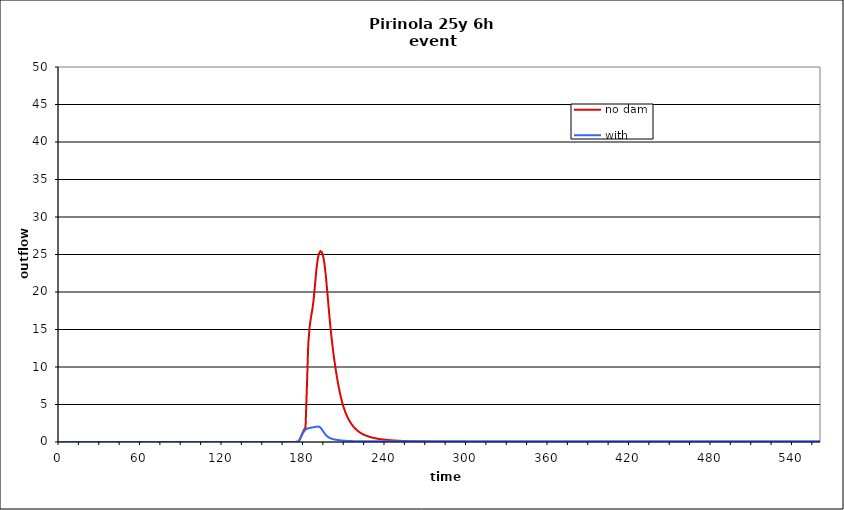
| Category | no dam | with dam |
|---|---|---|
| 0.0 | 0 | 0 |
| 1.0 | 0 | 0 |
| 2.0 | 0 | 0 |
| 3.0 | 0 | 0 |
| 4.0 | 0 | 0 |
| 5.0 | 0 | 0 |
| 6.0 | 0 | 0 |
| 7.0 | 0 | 0 |
| 8.0 | 0 | 0 |
| 9.0 | 0 | 0 |
| 10.0 | 0 | 0 |
| 11.0 | 0 | 0 |
| 12.0 | 0 | 0 |
| 13.0 | 0 | 0 |
| 14.0 | 0 | 0 |
| 15.0 | 0 | 0 |
| 16.0 | 0 | 0 |
| 17.0 | 0 | 0 |
| 18.0 | 0 | 0 |
| 19.0 | 0 | 0 |
| 20.0 | 0 | 0 |
| 21.0 | 0 | 0 |
| 22.0 | 0 | 0 |
| 23.0 | 0 | 0 |
| 24.0 | 0 | 0 |
| 25.0 | 0 | 0 |
| 26.0 | 0 | 0 |
| 27.0 | 0 | 0 |
| 28.0 | 0 | 0 |
| 29.0 | 0 | 0 |
| 30.0 | 0 | 0 |
| 31.0 | 0 | 0 |
| 32.0 | 0 | 0 |
| 33.0 | 0 | 0 |
| 34.0 | 0 | 0 |
| 35.0 | 0 | 0 |
| 36.0 | 0 | 0 |
| 37.0 | 0 | 0 |
| 38.0 | 0 | 0 |
| 39.0 | 0 | 0 |
| 40.0 | 0 | 0 |
| 41.0 | 0 | 0 |
| 42.0 | 0 | 0 |
| 43.0 | 0 | 0 |
| 44.0 | 0 | 0 |
| 45.0 | 0 | 0 |
| 46.0 | 0 | 0 |
| 47.0 | 0 | 0 |
| 48.0 | 0 | 0 |
| 49.0 | 0 | 0 |
| 50.0 | 0 | 0 |
| 51.0 | 0 | 0 |
| 52.0 | 0 | 0 |
| 53.0 | 0 | 0 |
| 54.0 | 0 | 0 |
| 55.0 | 0 | 0 |
| 56.0 | 0 | 0 |
| 57.0 | 0 | 0 |
| 58.0 | 0 | 0 |
| 59.0 | 0 | 0 |
| 60.0 | 0 | 0 |
| 61.0 | 0 | 0 |
| 62.0 | 0 | 0 |
| 63.0 | 0 | 0 |
| 64.0 | 0 | 0 |
| 65.0 | 0 | 0 |
| 66.0 | 0 | 0 |
| 67.0 | 0 | 0 |
| 68.0 | 0 | 0 |
| 69.0 | 0 | 0 |
| 70.0 | 0 | 0 |
| 71.0 | 0 | 0 |
| 72.0 | 0 | 0 |
| 73.0 | 0 | 0 |
| 74.0 | 0 | 0 |
| 75.0 | 0 | 0 |
| 76.0 | 0 | 0 |
| 77.0 | 0 | 0 |
| 78.0 | 0 | 0 |
| 79.0 | 0 | 0 |
| 80.0 | 0 | 0 |
| 81.0 | 0 | 0 |
| 82.0 | 0 | 0 |
| 83.0 | 0 | 0 |
| 84.0 | 0 | 0 |
| 85.0 | 0 | 0 |
| 86.0 | 0 | 0 |
| 87.0 | 0 | 0 |
| 88.0 | 0 | 0 |
| 89.0 | 0 | 0 |
| 90.0 | 0 | 0 |
| 91.0 | 0 | 0 |
| 92.0 | 0 | 0 |
| 93.0 | 0 | 0 |
| 94.0 | 0 | 0 |
| 95.0 | 0 | 0 |
| 96.0 | 0 | 0 |
| 97.0 | 0 | 0 |
| 98.0 | 0 | 0 |
| 99.0 | 0 | 0 |
| 100.0 | 0 | 0 |
| 101.0 | 0 | 0 |
| 102.0 | 0 | 0 |
| 103.0 | 0 | 0 |
| 104.0 | 0 | 0 |
| 105.0 | 0 | 0 |
| 106.0 | 0 | 0 |
| 107.0 | 0 | 0 |
| 108.0 | 0 | 0 |
| 109.0 | 0 | 0 |
| 110.0 | 0 | 0 |
| 111.0 | 0 | 0 |
| 112.0 | 0 | 0 |
| 113.0 | 0 | 0 |
| 114.0 | 0 | 0 |
| 115.0 | 0 | 0 |
| 116.0 | 0 | 0 |
| 117.0 | 0 | 0 |
| 118.0 | 0 | 0 |
| 119.0 | 0 | 0 |
| 120.0 | 0 | 0 |
| 121.0 | 0 | 0 |
| 122.0 | 0 | 0 |
| 123.0 | 0 | 0 |
| 124.0 | 0 | 0 |
| 125.0 | 0 | 0 |
| 126.0 | 0 | 0 |
| 127.0 | 0 | 0 |
| 128.0 | 0 | 0 |
| 129.0 | 0 | 0 |
| 130.0 | 0 | 0 |
| 131.0 | 0 | 0 |
| 132.0 | 0 | 0 |
| 133.0 | 0 | 0 |
| 134.0 | 0 | 0 |
| 135.0 | 0 | 0 |
| 136.0 | 0 | 0 |
| 137.0 | 0 | 0 |
| 138.0 | 0 | 0 |
| 139.0 | 0 | 0 |
| 140.0 | 0 | 0 |
| 141.0 | 0 | 0 |
| 142.0 | 0 | 0 |
| 143.0 | 0 | 0 |
| 144.0 | 0 | 0 |
| 145.0 | 0 | 0 |
| 146.0 | 0 | 0 |
| 147.0 | 0 | 0 |
| 148.0 | 0 | 0 |
| 149.0 | 0 | 0 |
| 150.0 | 0 | 0 |
| 151.0 | 0 | 0 |
| 152.0 | 0 | 0 |
| 153.0 | 0 | 0 |
| 154.0 | 0 | 0 |
| 155.0 | 0 | 0 |
| 156.0 | 0 | 0 |
| 157.0 | 0 | 0 |
| 158.0 | 0 | 0 |
| 159.0 | 0 | 0 |
| 160.0 | 0 | 0 |
| 161.0 | 0 | 0 |
| 162.0 | 0 | 0 |
| 163.0 | 0 | 0 |
| 164.0 | 0 | 0 |
| 165.0 | 0 | 0 |
| 166.0 | 0 | 0 |
| 167.0 | 0 | 0 |
| 168.0 | 0 | 0 |
| 169.0 | 0 | 0 |
| 170.0 | 0 | 0 |
| 171.0 | 0 | 0 |
| 172.0 | 0.001 | 0.001 |
| 173.0 | 0.005 | 0.005 |
| 174.0 | 0.016 | 0.016 |
| 175.0 | 0.035 | 0.036 |
| 176.0 | 0.067 | 0.06 |
| 177.0 | 0.464 | 0.407 |
| 178.0 | 0.874 | 0.773 |
| 179.0 | 1.299 | 1.151 |
| 180.0 | 1.665 | 1.454 |
| 181.0 | 1.937 | 1.647 |
| 182.0 | 7.318 | 1.752 |
| 183.0 | 13.035 | 1.816 |
| 184.0 | 15.331 | 1.864 |
| 185.0 | 16.633 | 1.903 |
| 186.0 | 17.663 | 1.939 |
| 187.0 | 19.027 | 1.972 |
| 188.0 | 21.022 | 2.002 |
| 189.0 | 23.011 | 2.03 |
| 190.0 | 24.413 | 2.056 |
| 191.0 | 25.185 | 2.043 |
| 192.0 | 25.445 | 1.918 |
| 193.0 | 25.321 | 1.7 |
| 194.0 | 24.767 | 1.424 |
| 195.0 | 23.692 | 1.149 |
| 196.0 | 22.064 | 0.922 |
| 197.0 | 20.084 | 0.751 |
| 198.0 | 17.967 | 0.622 |
| 199.0 | 15.946 | 0.526 |
| 200.0 | 14.151 | 0.453 |
| 201.0 | 12.583 | 0.397 |
| 202.0 | 11.195 | 0.353 |
| 203.0 | 9.932 | 0.317 |
| 204.0 | 8.777 | 0.286 |
| 205.0 | 7.731 | 0.258 |
| 206.0 | 6.801 | 0.234 |
| 207.0 | 5.984 | 0.213 |
| 208.0 | 5.273 | 0.194 |
| 209.0 | 4.659 | 0.178 |
| 210.0 | 4.129 | 0.164 |
| 211.0 | 3.67 | 0.152 |
| 212.0 | 3.273 | 0.142 |
| 213.0 | 2.925 | 0.134 |
| 214.0 | 2.619 | 0.127 |
| 215.0 | 2.349 | 0.121 |
| 216.0 | 2.109 | 0.116 |
| 217.0 | 1.898 | 0.111 |
| 218.0 | 1.712 | 0.107 |
| 219.0 | 1.549 | 0.103 |
| 220.0 | 1.404 | 0.1 |
| 221.0 | 1.276 | 0.098 |
| 222.0 | 1.164 | 0.096 |
| 223.0 | 1.064 | 0.094 |
| 224.0 | 0.975 | 0.093 |
| 225.0 | 0.896 | 0.091 |
| 226.0 | 0.824 | 0.09 |
| 227.0 | 0.759 | 0.089 |
| 228.0 | 0.7 | 0.089 |
| 229.0 | 0.646 | 0.088 |
| 230.0 | 0.596 | 0.088 |
| 231.0 | 0.551 | 0.088 |
| 232.0 | 0.511 | 0.088 |
| 233.0 | 0.474 | 0.088 |
| 234.0 | 0.441 | 0.087 |
| 235.0 | 0.411 | 0.087 |
| 236.0 | 0.383 | 0.087 |
| 237.0 | 0.358 | 0.087 |
| 238.0 | 0.335 | 0.087 |
| 239.0 | 0.314 | 0.087 |
| 240.0 | 0.294 | 0.087 |
| 241.0 | 0.276 | 0.087 |
| 242.0 | 0.259 | 0.087 |
| 243.0 | 0.244 | 0.087 |
| 244.0 | 0.23 | 0.087 |
| 245.0 | 0.216 | 0.087 |
| 246.0 | 0.204 | 0.087 |
| 247.0 | 0.192 | 0.087 |
| 248.0 | 0.182 | 0.087 |
| 249.0 | 0.172 | 0.087 |
| 250.0 | 0.162 | 0.087 |
| 251.0 | 0.153 | 0.087 |
| 252.0 | 0.145 | 0.087 |
| 253.0 | 0.138 | 0.087 |
| 254.0 | 0.13 | 0.087 |
| 255.0 | 0.124 | 0.087 |
| 256.0 | 0.117 | 0.087 |
| 257.0 | 0.111 | 0.087 |
| 258.0 | 0.106 | 0.087 |
| 259.0 | 0.1 | 0.087 |
| 260.0 | 0.095 | 0.087 |
| 261.0 | 0.09 | 0.087 |
| 262.0 | 0.086 | 0.087 |
| 263.0 | 0.082 | 0.087 |
| 264.0 | 0.078 | 0.087 |
| 265.0 | 0.074 | 0.087 |
| 266.0 | 0.07 | 0.087 |
| 267.0 | 0.067 | 0.087 |
| 268.0 | 0.064 | 0.087 |
| 269.0 | 0.061 | 0.087 |
| 270.0 | 0.058 | 0.087 |
| 271.0 | 0.055 | 0.087 |
| 272.0 | 0.053 | 0.087 |
| 273.0 | 0.05 | 0.087 |
| 274.0 | 0.048 | 0.087 |
| 275.0 | 0.046 | 0.087 |
| 276.0 | 0.044 | 0.087 |
| 277.0 | 0.042 | 0.087 |
| 278.0 | 0.04 | 0.087 |
| 279.0 | 0.038 | 0.087 |
| 280.0 | 0.036 | 0.087 |
| 281.0 | 0.035 | 0.087 |
| 282.0 | 0.033 | 0.087 |
| 283.0 | 0.032 | 0.087 |
| 284.0 | 0.03 | 0.087 |
| 285.0 | 0.029 | 0.087 |
| 286.0 | 0.028 | 0.087 |
| 287.0 | 0.027 | 0.087 |
| 288.0 | 0.026 | 0.087 |
| 289.0 | 0.025 | 0.087 |
| 290.0 | 0.023 | 0.087 |
| 291.0 | 0.022 | 0.087 |
| 292.0 | 0.022 | 0.087 |
| 293.0 | 0.021 | 0.087 |
| 294.0 | 0.02 | 0.087 |
| 295.0 | 0.019 | 0.087 |
| 296.0 | 0.018 | 0.087 |
| 297.0 | 0.017 | 0.087 |
| 298.0 | 0.017 | 0.087 |
| 299.0 | 0.016 | 0.087 |
| 300.0 | 0.015 | 0.087 |
| 301.0 | 0.015 | 0.087 |
| 302.0 | 0.014 | 0.087 |
| 303.0 | 0.014 | 0.087 |
| 304.0 | 0.013 | 0.087 |
| 305.0 | 0.013 | 0.087 |
| 306.0 | 0.012 | 0.087 |
| 307.0 | 0.012 | 0.087 |
| 308.0 | 0.011 | 0.087 |
| 309.0 | 0.011 | 0.087 |
| 310.0 | 0.01 | 0.087 |
| 311.0 | 0.01 | 0.087 |
| 312.0 | 0.009 | 0.087 |
| 313.0 | 0.009 | 0.087 |
| 314.0 | 0.009 | 0.087 |
| 315.0 | 0.008 | 0.087 |
| 316.0 | 0.008 | 0.087 |
| 317.0 | 0.007 | 0.087 |
| 318.0 | 0.007 | 0.087 |
| 319.0 | 0.007 | 0.087 |
| 320.0 | 0.006 | 0.087 |
| 321.0 | 0.006 | 0.087 |
| 322.0 | 0.006 | 0.087 |
| 323.0 | 0.006 | 0.087 |
| 324.0 | 0.005 | 0.087 |
| 325.0 | 0.005 | 0.087 |
| 326.0 | 0.005 | 0.087 |
| 327.0 | 0.005 | 0.087 |
| 328.0 | 0.004 | 0.087 |
| 329.0 | 0.004 | 0.087 |
| 330.0 | 0.004 | 0.087 |
| 331.0 | 0.004 | 0.087 |
| 332.0 | 0.004 | 0.087 |
| 333.0 | 0.003 | 0.087 |
| 334.0 | 0.003 | 0.087 |
| 335.0 | 0.003 | 0.087 |
| 336.0 | 0.003 | 0.087 |
| 337.0 | 0.003 | 0.087 |
| 338.0 | 0.003 | 0.087 |
| 339.0 | 0.002 | 0.087 |
| 340.0 | 0.002 | 0.087 |
| 341.0 | 0.002 | 0.087 |
| 342.0 | 0.002 | 0.087 |
| 343.0 | 0.002 | 0.087 |
| 344.0 | 0.002 | 0.087 |
| 345.0 | 0.002 | 0.087 |
| 346.0 | 0.002 | 0.087 |
| 347.0 | 0.001 | 0.087 |
| 348.0 | 0.001 | 0.087 |
| 349.0 | 0.001 | 0.087 |
| 350.0 | 0.001 | 0.087 |
| 351.0 | 0.001 | 0.087 |
| 352.0 | 0.001 | 0.087 |
| 353.0 | 0.001 | 0.087 |
| 354.0 | 0.001 | 0.087 |
| 355.0 | 0.001 | 0.087 |
| 356.0 | 0.001 | 0.087 |
| 357.0 | 0.001 | 0.087 |
| 358.0 | 0.001 | 0.087 |
| 359.0 | 0.001 | 0.087 |
| 360.0 | 0.001 | 0.087 |
| 361.0 | 0.001 | 0.087 |
| 362.0 | 0 | 0.087 |
| 363.0 | 0 | 0.087 |
| 364.0 | 0 | 0.087 |
| 365.0 | 0 | 0.087 |
| 366.0 | 0 | 0.087 |
| 367.0 | 0 | 0.087 |
| 368.0 | 0 | 0.087 |
| 369.0 | 0 | 0.087 |
| 370.0 | 0 | 0.087 |
| 371.0 | 0 | 0.087 |
| 372.0 | 0 | 0.087 |
| 373.0 | 0 | 0.087 |
| 374.0 | 0 | 0.087 |
| 375.0 | 0 | 0.087 |
| 376.0 | 0 | 0.087 |
| 377.0 | 0 | 0.087 |
| 378.0 | 0 | 0.087 |
| 379.0 | 0 | 0.087 |
| 380.0 | 0 | 0.087 |
| 381.0 | 0 | 0.087 |
| 382.0 | 0 | 0.087 |
| 383.0 | 0 | 0.086 |
| 384.0 | 0 | 0.086 |
| 385.0 | 0 | 0.086 |
| 386.0 | 0 | 0.086 |
| 387.0 | 0 | 0.086 |
| 388.0 | 0 | 0.086 |
| 389.0 | 0 | 0.086 |
| 390.0 | 0 | 0.086 |
| 391.0 | 0 | 0.086 |
| 392.0 | 0 | 0.086 |
| 393.0 | 0 | 0.086 |
| 394.0 | 0 | 0.086 |
| 395.0 | 0 | 0.086 |
| 396.0 | 0 | 0.086 |
| 397.0 | 0 | 0.086 |
| 398.0 | 0 | 0.086 |
| 399.0 | 0 | 0.086 |
| 400.0 | 0 | 0.086 |
| 401.0 | 0 | 0.086 |
| 402.0 | 0 | 0.086 |
| 403.0 | 0 | 0.086 |
| 404.0 | 0 | 0.086 |
| 405.0 | 0 | 0.086 |
| 406.0 | 0 | 0.086 |
| 407.0 | 0 | 0.086 |
| 408.0 | 0 | 0.086 |
| 409.0 | 0 | 0.086 |
| 410.0 | 0 | 0.086 |
| 411.0 | 0 | 0.086 |
| 412.0 | 0 | 0.086 |
| 413.0 | 0 | 0.086 |
| 414.0 | 0 | 0.086 |
| 415.0 | 0 | 0.086 |
| 416.0 | 0 | 0.086 |
| 417.0 | 0 | 0.086 |
| 418.0 | 0 | 0.086 |
| 419.0 | 0 | 0.086 |
| 420.0 | 0 | 0.086 |
| 421.0 | 0 | 0.086 |
| 422.0 | 0 | 0.086 |
| 423.0 | 0 | 0.086 |
| 424.0 | 0 | 0.086 |
| 425.0 | 0 | 0.086 |
| 426.0 | 0 | 0.086 |
| 427.0 | 0 | 0.086 |
| 428.0 | 0 | 0.086 |
| 429.0 | 0 | 0.086 |
| 430.0 | 0 | 0.086 |
| 431.0 | 0 | 0.086 |
| 432.0 | 0 | 0.086 |
| 433.0 | 0 | 0.086 |
| 434.0 | 0 | 0.086 |
| 435.0 | 0 | 0.086 |
| 436.0 | 0 | 0.086 |
| 437.0 | 0 | 0.086 |
| 438.0 | 0 | 0.086 |
| 439.0 | 0 | 0.086 |
| 440.0 | 0 | 0.086 |
| 441.0 | 0 | 0.086 |
| 442.0 | 0 | 0.086 |
| 443.0 | 0 | 0.086 |
| 444.0 | 0 | 0.086 |
| 445.0 | 0 | 0.086 |
| 446.0 | 0 | 0.086 |
| 447.0 | 0 | 0.086 |
| 448.0 | 0 | 0.086 |
| 449.0 | 0 | 0.086 |
| 450.0 | 0 | 0.086 |
| 451.0 | 0 | 0.086 |
| 452.0 | 0 | 0.086 |
| 453.0 | 0 | 0.086 |
| 454.0 | 0 | 0.086 |
| 455.0 | 0 | 0.086 |
| 456.0 | 0 | 0.086 |
| 457.0 | 0 | 0.086 |
| 458.0 | 0 | 0.086 |
| 459.0 | 0 | 0.086 |
| 460.0 | 0 | 0.086 |
| 461.0 | 0 | 0.086 |
| 462.0 | 0 | 0.086 |
| 463.0 | 0 | 0.086 |
| 464.0 | 0 | 0.086 |
| 465.0 | 0 | 0.086 |
| 466.0 | 0 | 0.086 |
| 467.0 | 0 | 0.086 |
| 468.0 | 0 | 0.086 |
| 469.0 | 0 | 0.086 |
| 470.0 | 0 | 0.086 |
| 471.0 | 0 | 0.085 |
| 472.0 | 0 | 0.085 |
| 473.0 | 0 | 0.085 |
| 474.0 | 0 | 0.085 |
| 475.0 | 0 | 0.085 |
| 476.0 | 0 | 0.085 |
| 477.0 | 0 | 0.085 |
| 478.0 | 0 | 0.085 |
| 479.0 | 0 | 0.085 |
| 480.0 | 0 | 0.085 |
| 481.0 | 0 | 0.085 |
| 482.0 | 0 | 0.085 |
| 483.0 | 0 | 0.085 |
| 484.0 | 0 | 0.085 |
| 485.0 | 0 | 0.085 |
| 486.0 | 0 | 0.085 |
| 487.0 | 0 | 0.085 |
| 488.0 | 0 | 0.085 |
| 489.0 | 0 | 0.085 |
| 490.0 | 0 | 0.085 |
| 491.0 | 0 | 0.085 |
| 492.0 | 0 | 0.085 |
| 493.0 | 0 | 0.085 |
| 494.0 | 0 | 0.085 |
| 495.0 | 0 | 0.085 |
| 496.0 | 0 | 0.085 |
| 497.0 | 0 | 0.085 |
| 498.0 | 0 | 0.085 |
| 499.0 | 0 | 0.085 |
| 500.0 | 0 | 0.085 |
| 501.0 | 0 | 0.085 |
| 502.0 | 0 | 0.085 |
| 503.0 | 0 | 0.085 |
| 504.0 | 0 | 0.085 |
| 505.0 | 0 | 0.085 |
| 506.0 | 0 | 0.085 |
| 507.0 | 0 | 0.085 |
| 508.0 | 0 | 0.085 |
| 509.0 | 0 | 0.085 |
| 510.0 | 0 | 0.085 |
| 511.0 | 0 | 0.085 |
| 512.0 | 0 | 0.085 |
| 513.0 | 0 | 0.085 |
| 514.0 | 0 | 0.085 |
| 515.0 | 0 | 0.085 |
| 516.0 | 0 | 0.085 |
| 517.0 | 0 | 0.085 |
| 518.0 | 0 | 0.085 |
| 519.0 | 0 | 0.085 |
| 520.0 | 0 | 0.085 |
| 521.0 | 0 | 0.085 |
| 522.0 | 0 | 0.085 |
| 523.0 | 0 | 0.085 |
| 524.0 | 0 | 0.085 |
| 525.0 | 0 | 0.085 |
| 526.0 | 0 | 0.085 |
| 527.0 | 0 | 0.085 |
| 528.0 | 0 | 0.085 |
| 529.0 | 0 | 0.085 |
| 530.0 | 0 | 0.085 |
| 531.0 | 0 | 0.085 |
| 532.0 | 0 | 0.085 |
| 533.0 | 0 | 0.085 |
| 534.0 | 0 | 0.085 |
| 535.0 | 0 | 0.085 |
| 536.0 | 0 | 0.085 |
| 537.0 | 0 | 0.085 |
| 538.0 | 0 | 0.085 |
| 539.0 | 0 | 0.085 |
| 540.0 | 0 | 0.085 |
| 541.0 | 0 | 0.085 |
| 542.0 | 0 | 0.085 |
| 543.0 | 0 | 0.085 |
| 544.0 | 0 | 0.085 |
| 545.0 | 0 | 0.085 |
| 546.0 | 0 | 0.085 |
| 547.0 | 0 | 0.085 |
| 548.0 | 0 | 0.085 |
| 549.0 | 0 | 0.085 |
| 550.0 | 0 | 0.085 |
| 551.0 | 0 | 0.085 |
| 552.0 | 0 | 0.085 |
| 553.0 | 0 | 0.085 |
| 554.0 | 0 | 0.084 |
| 555.0 | 0 | 0.084 |
| 556.0 | 0 | 0.084 |
| 557.0 | 0 | 0.084 |
| 558.0 | 0 | 0.084 |
| 559.0 | 0 | 0.084 |
| 560.0 | 0 | 0.084 |